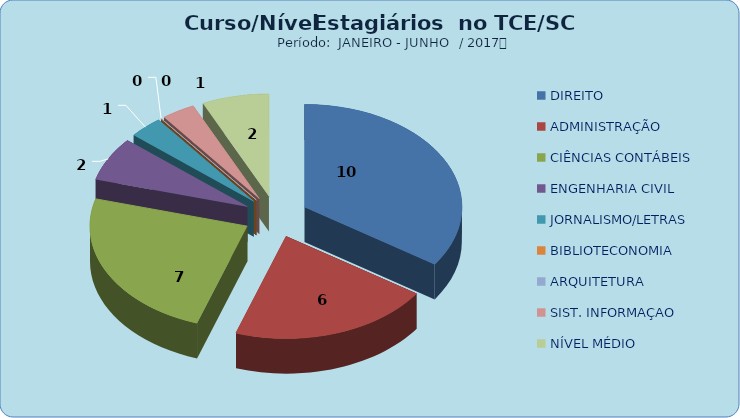
| Category | Series 0 |
|---|---|
| DIREITO | 10 |
| ADMINISTRAÇÃO | 6 |
| CIÊNCIAS CONTÁBEIS | 7 |
| ENGENHARIA CIVIL | 2 |
| JORNALISMO/LETRAS | 1 |
| BIBLIOTECONOMIA | 0 |
| ARQUITETURA | 0 |
| SIST. INFORMAÇAO | 1 |
| NÍVEL MÉDIO | 2 |